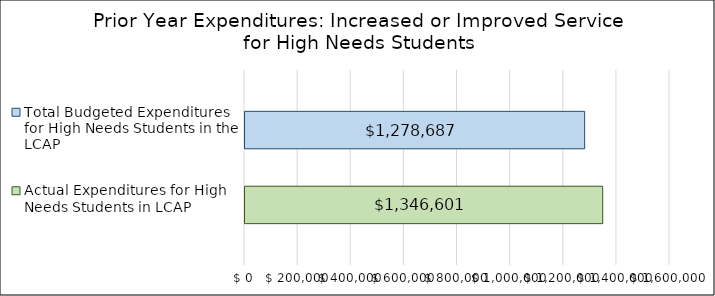
| Category | Actual Expenditures for High Needs Students in LCAP | Total Budgeted Expenditures for High Needs Students in the LCAP |
|---|---|---|
| 0 | 1346601 | 1278687 |